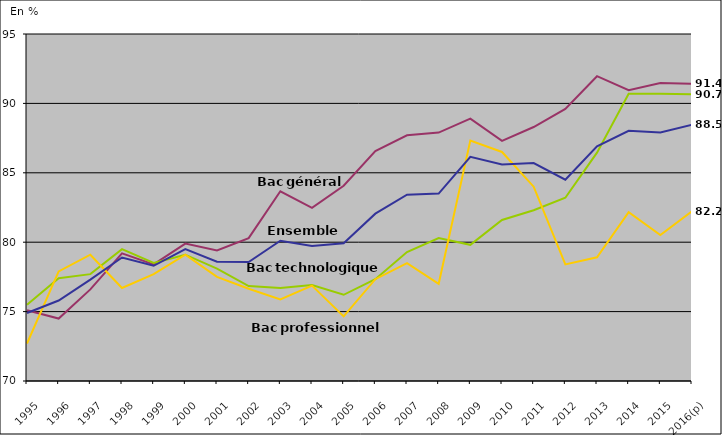
| Category | Baccalauréat général | Baccalauréat technologique | Baccalauréat professionnel | Ensemble |
|---|---|---|---|---|
| 1995 | 75.1 | 75.5 | 72.7 | 74.9 |
| 1996 | 74.5 | 77.4 | 77.9 | 75.8 |
| 1997 | 76.6 | 77.7 | 79.1 | 77.3 |
| 1998 | 79.2 | 79.5 | 76.7 | 78.9 |
| 1999 | 78.4 | 78.5 | 77.7 | 78.3 |
| 2000 | 79.9 | 79.1 | 79.1 | 79.5 |
| 2001 | 79.4 | 78.1 | 77.5 | 78.6 |
| 2002 | 80.297 | 76.838 | 76.645 | 78.57 |
| 2003 | 83.669 | 76.703 | 75.876 | 80.104 |
| 2004 | 82.477 | 76.92 | 76.873 | 79.725 |
| 2005 | 84.065 | 76.211 | 74.657 | 79.921 |
| 2006 | 86.566 | 77.333 | 77.333 | 82.056 |
| 2007 | 87.704 | 79.291 | 78.487 | 83.419 |
| 2008 | 87.9 | 80.3 | 77 | 83.5 |
| 2009 | 88.898 | 79.81 | 87.33 | 86.156 |
| 2010 | 87.3 | 81.6 | 86.5 | 85.6 |
| 2011 | 88.3 | 82.3 | 84 | 85.7 |
| 2012 | 89.6 | 83.2 | 78.4 | 84.5 |
| 2013 | 91.96 | 86.45 | 78.91 | 86.906 |
| 2014 | 90.95 | 90.7 | 82.16 | 88.03 |
| 2015 | 91.477 | 90.699 | 80.522 | 87.91 |
| 2016(p) | 91.411 | 90.66 | 82.227 | 88.466 |